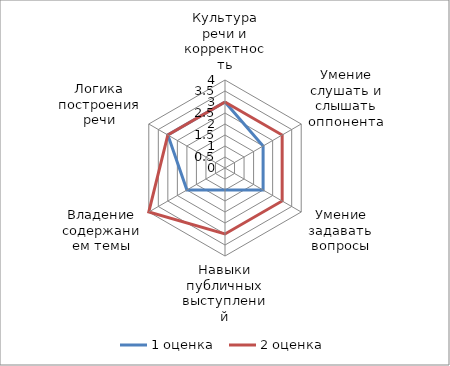
| Category | 1 оценка  | 2 оценка |
|---|---|---|
| Культура речи и корректность | 3 | 3 |
| Умение слушать и слышать оппонента | 2 | 3 |
| Умение задавать вопросы | 2 | 3 |
| Навыки публичных выступлений | 1 | 3 |
| Владение содержанием темы | 2 | 4 |
| Логика построения речи | 3 | 3 |